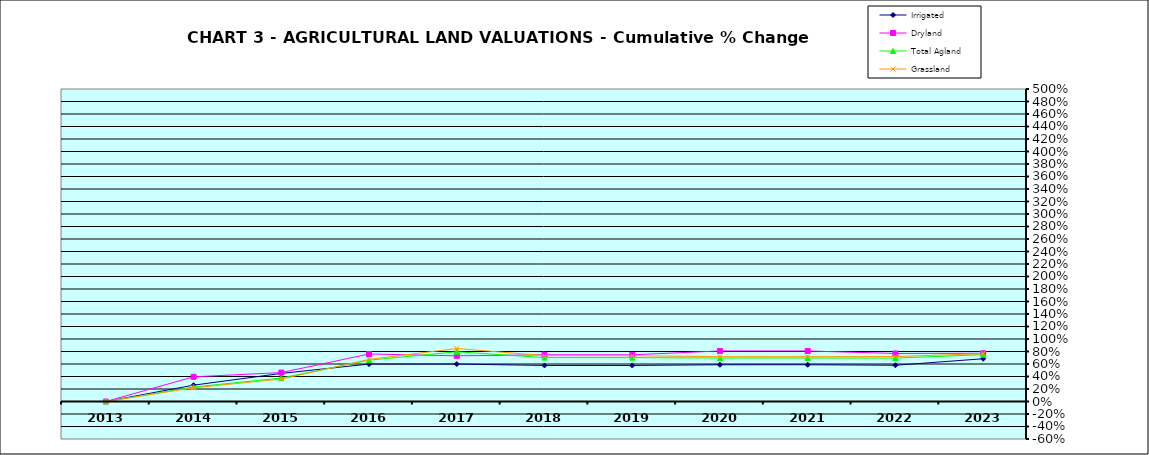
| Category | Irrigated | Dryland | Total Agland | Grassland |
|---|---|---|---|---|
| 2013.0 | 0 | 0 | 0 | 0 |
| 2014.0 | 0.261 | 0.395 | 0.231 | 0.22 |
| 2015.0 | 0.449 | 0.463 | 0.376 | 0.359 |
| 2016.0 | 0.599 | 0.76 | 0.661 | 0.674 |
| 2017.0 | 0.599 | 0.731 | 0.796 | 0.848 |
| 2018.0 | 0.577 | 0.748 | 0.703 | 0.733 |
| 2019.0 | 0.576 | 0.747 | 0.702 | 0.732 |
| 2020.0 | 0.588 | 0.809 | 0.695 | 0.717 |
| 2021.0 | 0.588 | 0.809 | 0.696 | 0.717 |
| 2022.0 | 0.58 | 0.769 | 0.694 | 0.719 |
| 2023.0 | 0.684 | 0.771 | 0.749 | 0.766 |